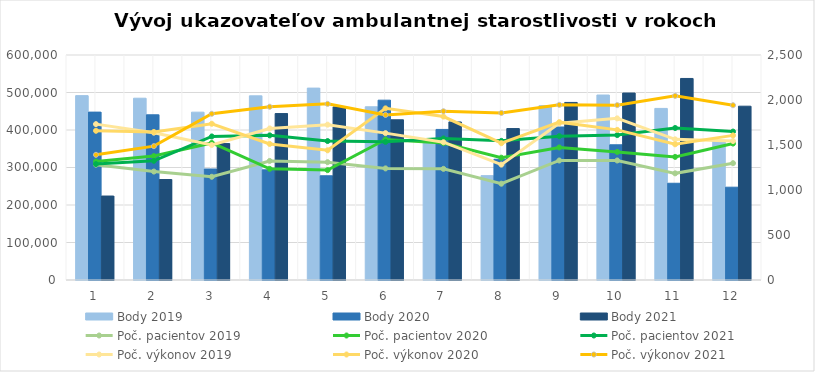
| Category | Body 2019 | Body 2020 | Body 2021 |
|---|---|---|---|
| 0 | 491635 | 447685 | 223910 |
| 1 | 484765 | 440525 | 267970 |
| 2 | 447580 | 296005 | 363760 |
| 3 | 491110 | 293775 | 443830 |
| 4 | 511725 | 277945 | 461550 |
| 5 | 461920 | 479510 | 427225 |
| 6 | 375475 | 401535 | 421530 |
| 7 | 278295 | 321940 | 403815 |
| 8 | 464910 | 408035 | 473530 |
| 9 | 493270 | 360545 | 498550 |
| 10 | 457575 | 257965 | 537440 |
| 11 | 372285 | 247460 | 463465 |